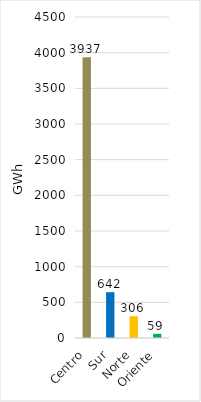
| Category | Series 0 |
|---|---|
| Centro | 3937.321 |
| Sur | 642.351 |
| Norte | 305.575 |
| Oriente | 59.335 |